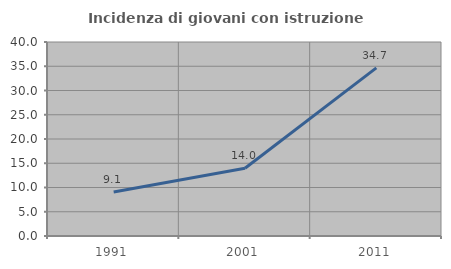
| Category | Incidenza di giovani con istruzione universitaria |
|---|---|
| 1991.0 | 9.091 |
| 2001.0 | 13.971 |
| 2011.0 | 34.653 |